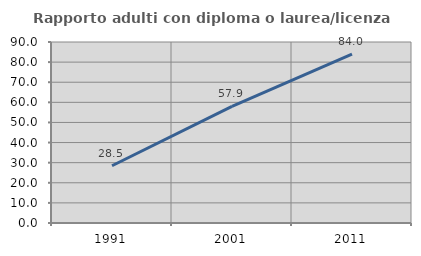
| Category | Rapporto adulti con diploma o laurea/licenza media  |
|---|---|
| 1991.0 | 28.467 |
| 2001.0 | 57.944 |
| 2011.0 | 83.966 |